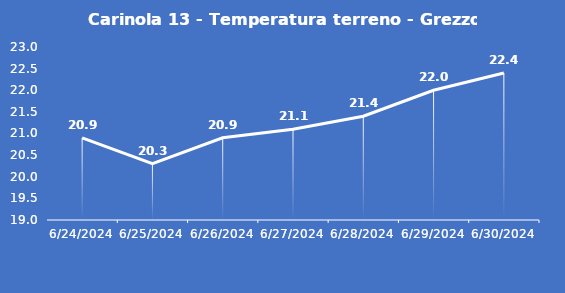
| Category | Carinola 13 - Temperatura terreno - Grezzo (°C) |
|---|---|
| 6/24/24 | 20.9 |
| 6/25/24 | 20.3 |
| 6/26/24 | 20.9 |
| 6/27/24 | 21.1 |
| 6/28/24 | 21.4 |
| 6/29/24 | 22 |
| 6/30/24 | 22.4 |